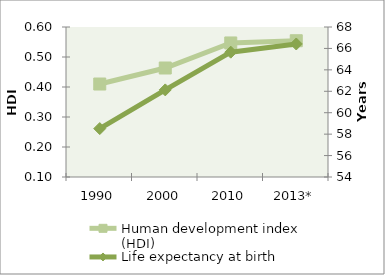
| Category | Human development index (HDI) |
|---|---|
| 1990 | 0.41 |
| 2000 | 0.463 |
| 2010 | 0.547 |
| 2013* | 0.554 |